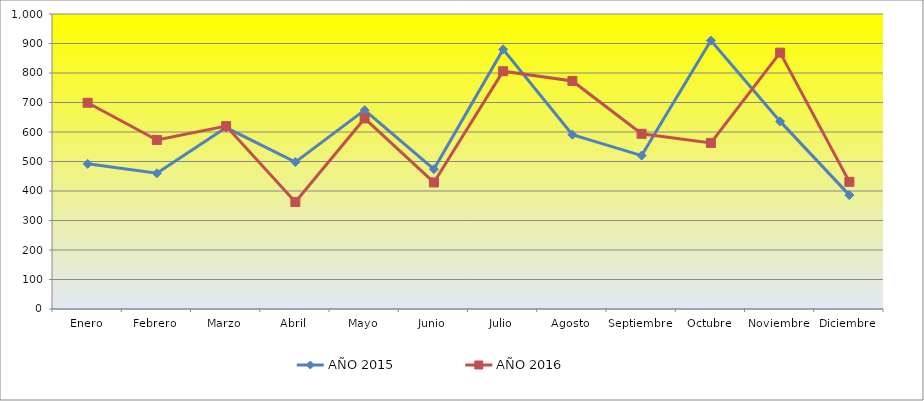
| Category | AÑO 2015 | AÑO 2016 |
|---|---|---|
| Enero | 492 | 699 |
| Febrero | 460 | 573 |
| Marzo | 615 | 620 |
| Abril | 498 | 363 |
| Mayo | 674 | 646 |
| Junio | 474 | 429 |
| Julio | 880 | 806 |
| Agosto | 591 | 773 |
| Septiembre | 520 | 594 |
| Octubre | 910 | 563 |
| Noviembre | 636 | 869 |
| Diciembre | 386 | 431 |